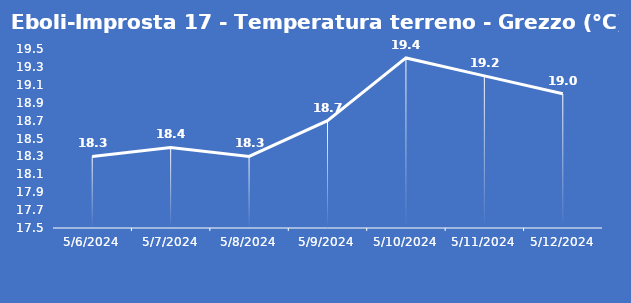
| Category | Eboli-Improsta 17 - Temperatura terreno - Grezzo (°C) |
|---|---|
| 5/6/24 | 18.3 |
| 5/7/24 | 18.4 |
| 5/8/24 | 18.3 |
| 5/9/24 | 18.7 |
| 5/10/24 | 19.4 |
| 5/11/24 | 19.2 |
| 5/12/24 | 19 |